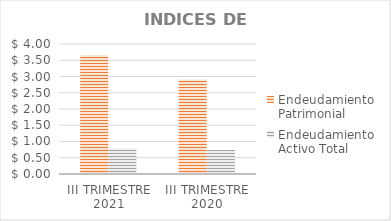
| Category | Endeudamiento Patrimonial | Endeudamiento Activo Total |
|---|---|---|
| III TRIMESTRE 2021 | 3.66 | 0.785 |
| III TRIMESTRE 2020 | 2.91 | 0.74 |